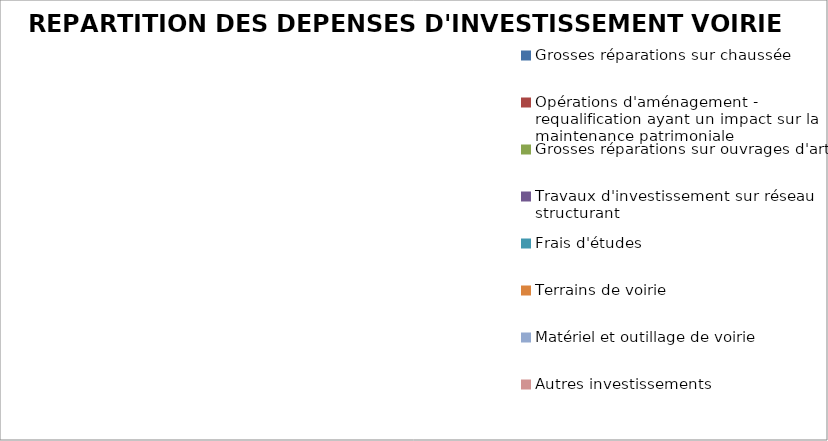
| Category | Series 0 |
|---|---|
| Grosses réparations sur chaussée | 0 |
| Opérations d'aménagement - requalification ayant un impact sur la maintenance patrimoniale | 0 |
| Grosses réparations sur ouvrages d'art | 0 |
| Travaux d'investissement sur réseau structurant | 0 |
| Frais d'études | 0 |
| Terrains de voirie | 0 |
| Matériel et outillage de voirie | 0 |
| Autres investissements | 0 |